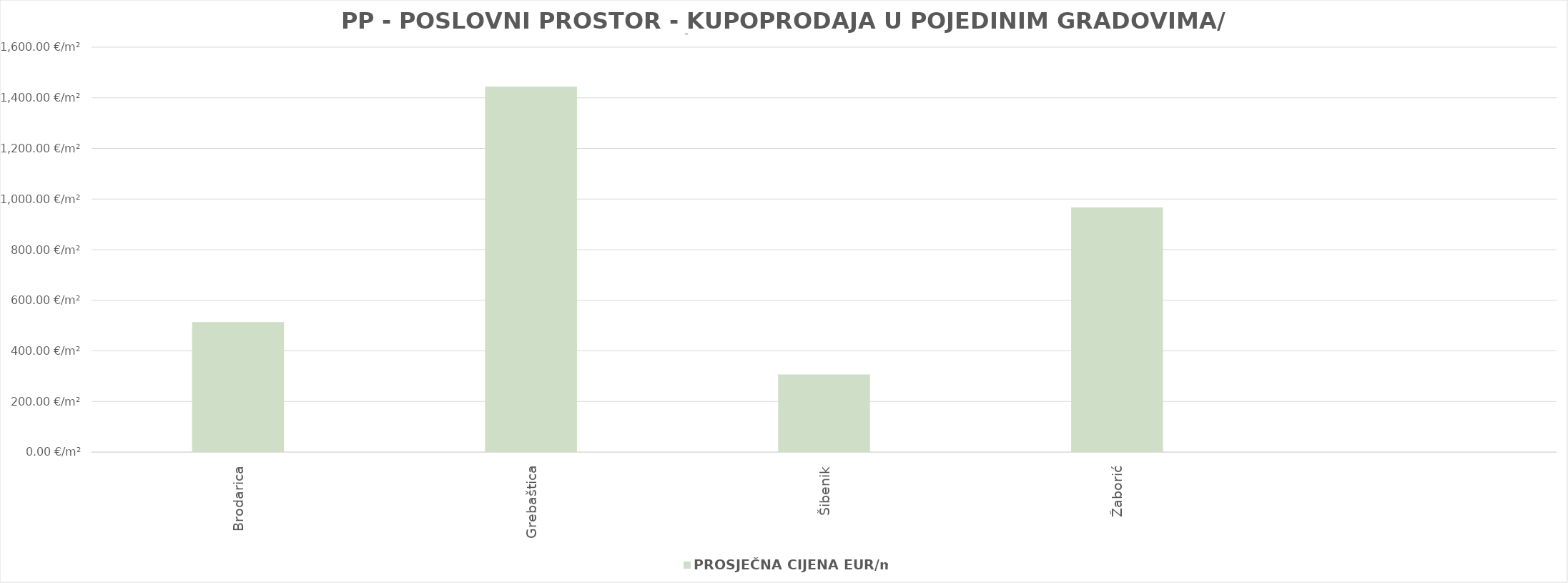
| Category | PROSJEČNA CIJENA EUR/m2 |
|---|---|
| Brodarica | 1901-05-27 23:52:18 |
| Grebaštica | 1903-12-14 12:34:26 |
| Šibenik | 1900-11-02 01:08:49 |
| Žaborić | 1902-08-24 02:03:30 |